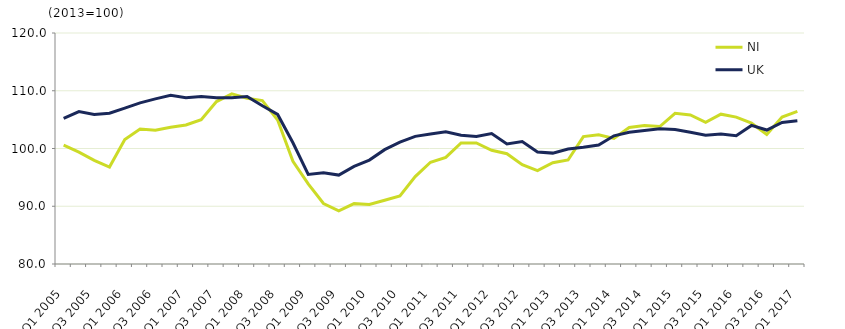
| Category | NI  | UK  |
|---|---|---|
| Q1 2005 | 100.583 | 105.2 |
| Q2 2005 | 99.378 | 106.4 |
| Q3 2005 | 97.933 | 105.9 |
| Q4 2005 | 96.788 | 106.1 |
| Q1 2006 | 101.562 | 107 |
| Q2 2006 | 103.377 | 107.9 |
| Q3 2006 | 103.147 | 108.6 |
| Q4 2006 | 103.665 | 109.2 |
| Q1 2007 | 104.07 | 108.8 |
| Q2 2007 | 105.003 | 109 |
| Q3 2007 | 108.131 | 108.8 |
| Q4 2007 | 109.452 | 108.8 |
| Q1 2008 | 108.699 | 109 |
| Q2 2008 | 108.296 | 107.4 |
| Q3 2008 | 104.934 | 105.9 |
| Q4 2008 | 97.798 | 101 |
| Q1 2009 | 93.867 | 95.5 |
| Q2 2009 | 90.472 | 95.8 |
| Q3 2009 | 89.208 | 95.4 |
| Q4 2009 | 90.454 | 96.9 |
| Q1 2010 | 90.314 | 98 |
| Q2 2010 | 91.042 | 99.8 |
| Q3 2010 | 91.777 | 101.1 |
| Q4 2010 | 95.145 | 102.1 |
| Q1 2011 | 97.618 | 102.5 |
| Q2 2011 | 98.465 | 102.9 |
| Q3 2011 | 100.965 | 102.3 |
| Q4 2011 | 100.95 | 102.1 |
| Q1 2012 | 99.683 | 102.6 |
| Q2 2012 | 99.088 | 100.8 |
| Q3 2012 | 97.193 | 101.2 |
| Q4 2012 | 96.166 | 99.4 |
| Q1 2013 | 97.53 | 99.2 |
| Q2 2013 | 98.011 | 99.9 |
| Q3 2013 | 102.067 | 100.2 |
| Q4 2013 | 102.392 | 100.6 |
| Q1 2014 | 101.755 | 102.2 |
| Q2 2014 | 103.638 | 102.8 |
| Q3 2014 | 103.98 | 103.1 |
| Q4 2014 | 103.806 | 103.4 |
| Q1 2015 | 106.093 | 103.3 |
| Q2 2015 | 105.812 | 102.8 |
| Q3 2015 | 104.547 | 102.3 |
| Q4 2015 | 105.947 | 102.5 |
| Q1 2016 | 105.433 | 102.2 |
| Q2 2016 | 104.383 | 104 |
| Q3 2016 | 102.422 | 103.2 |
| Q4 2016 | 105.435 | 104.5 |
| Q1 2017 | 106.421 | 104.8 |